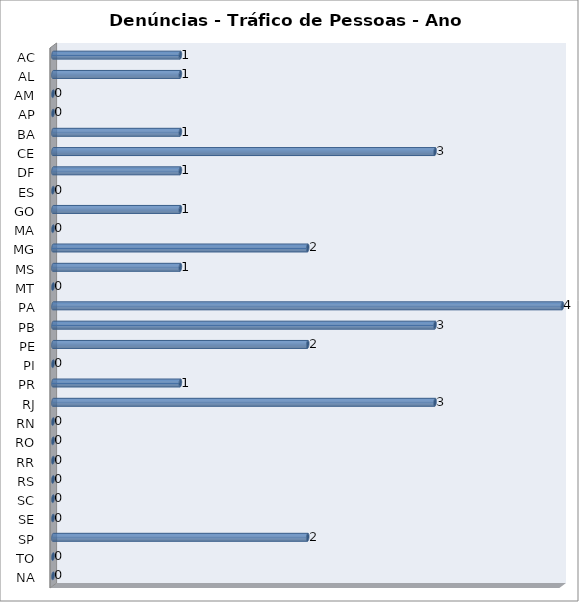
| Category | Series 0 |
|---|---|
| AC | 1 |
| AL | 1 |
| AM | 0 |
| AP | 0 |
| BA | 1 |
| CE | 3 |
| DF | 1 |
| ES | 0 |
| GO | 1 |
| MA | 0 |
| MG | 2 |
| MS | 1 |
| MT | 0 |
| PA | 4 |
| PB | 3 |
| PE | 2 |
| PI | 0 |
| PR | 1 |
| RJ | 3 |
| RN | 0 |
| RO | 0 |
| RR | 0 |
| RS | 0 |
| SC | 0 |
| SE | 0 |
| SP | 2 |
| TO | 0 |
| NA | 0 |